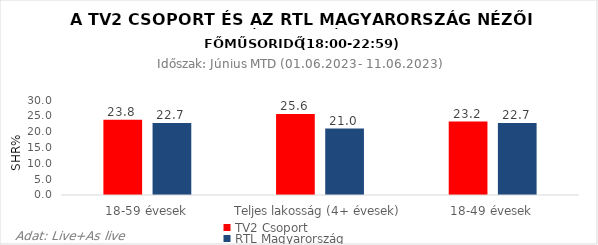
| Category | TV2 Csoport | RTL Magyarország |
|---|---|---|
| 18-59 évesek | 23.8 | 22.7 |
| Teljes lakosság (4+ évesek) | 25.6 | 21 |
| 18-49 évesek | 23.2 | 22.7 |